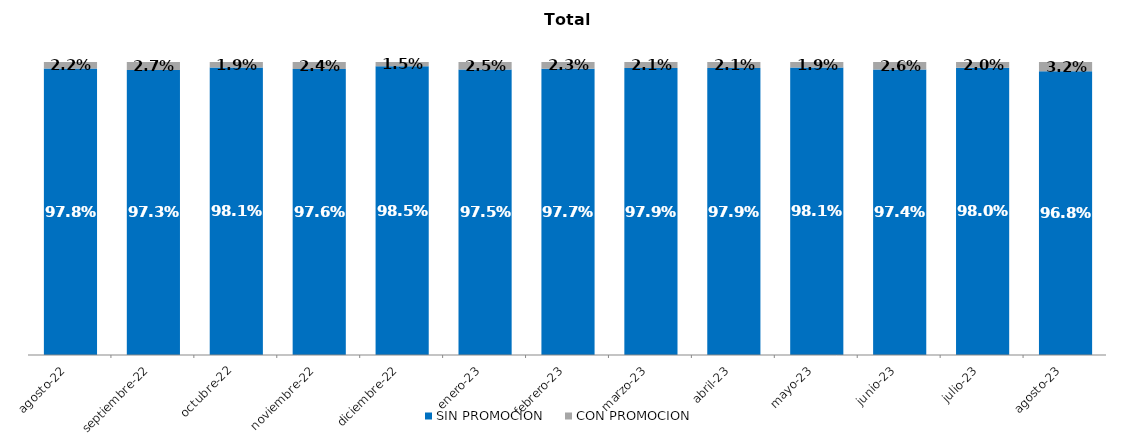
| Category | SIN PROMOCION   | CON PROMOCION   |
|---|---|---|
| 2022-08-01 | 0.978 | 0.022 |
| 2022-09-01 | 0.973 | 0.027 |
| 2022-10-01 | 0.981 | 0.019 |
| 2022-11-01 | 0.976 | 0.024 |
| 2022-12-01 | 0.985 | 0.015 |
| 2023-01-01 | 0.975 | 0.025 |
| 2023-02-01 | 0.977 | 0.023 |
| 2023-03-01 | 0.979 | 0.021 |
| 2023-04-01 | 0.979 | 0.021 |
| 2023-05-01 | 0.981 | 0.019 |
| 2023-06-01 | 0.974 | 0.026 |
| 2023-07-01 | 0.98 | 0.02 |
| 2023-08-01 | 0.968 | 0.032 |